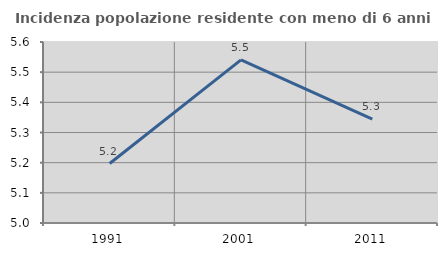
| Category | Incidenza popolazione residente con meno di 6 anni |
|---|---|
| 1991.0 | 5.197 |
| 2001.0 | 5.541 |
| 2011.0 | 5.344 |